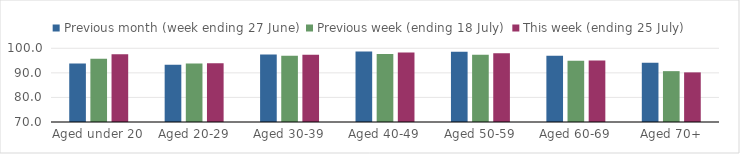
| Category | Previous month (week ending 27 June) | Previous week (ending 18 July) | This week (ending 25 July) |
|---|---|---|---|
| Aged under 20 | 93.828 | 95.698 | 97.551 |
| Aged 20-29 | 93.313 | 93.799 | 93.929 |
| Aged 30-39 | 97.522 | 96.96 | 97.347 |
| Aged 40-49 | 98.685 | 97.641 | 98.315 |
| Aged 50-59 | 98.624 | 97.336 | 97.942 |
| Aged 60-69 | 97 | 94.923 | 95.039 |
| Aged 70+ | 94.141 | 90.695 | 90.196 |